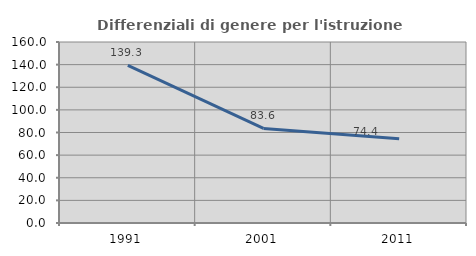
| Category | Differenziali di genere per l'istruzione superiore |
|---|---|
| 1991.0 | 139.286 |
| 2001.0 | 83.607 |
| 2011.0 | 74.4 |